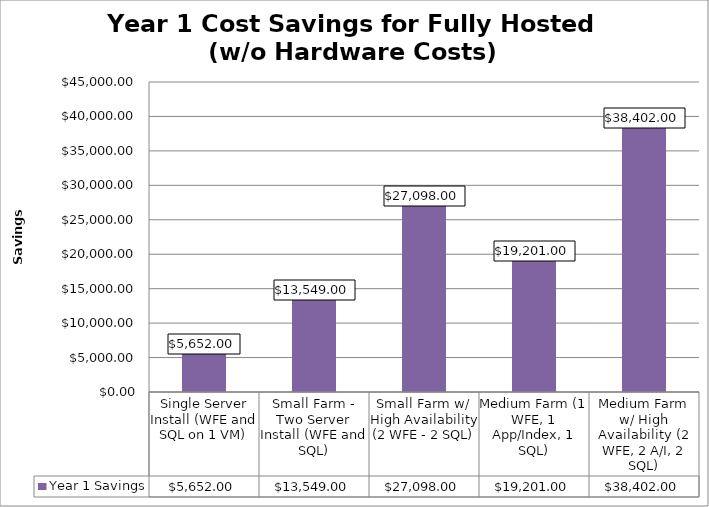
| Category | Year 1 Savings |
|---|---|
| Single Server Install (WFE and SQL on 1 VM) | 5652 |
| Small Farm - Two Server Install (WFE and SQL) | 13549 |
| Small Farm w/ High Availability (2 WFE - 2 SQL) | 27098 |
| Medium Farm (1 WFE, 1 App/Index, 1 SQL) | 19201 |
| Medium Farm w/ High Availability (2 WFE, 2 A/I, 2 SQL) | 38402 |